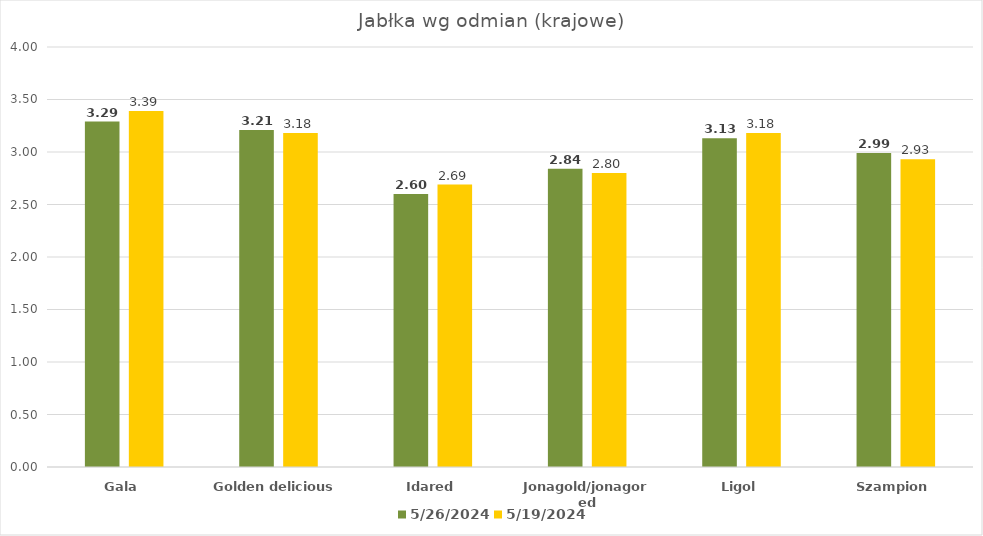
| Category | 2024-05-26 | 2024-05-19 |
|---|---|---|
| Gala | 3.29 | 3.39 |
| Golden delicious | 3.21 | 3.18 |
| Idared | 2.6 | 2.69 |
| Jonagold/jonagored | 2.84 | 2.8 |
| Ligol | 3.13 | 3.18 |
| Szampion | 2.99 | 2.93 |